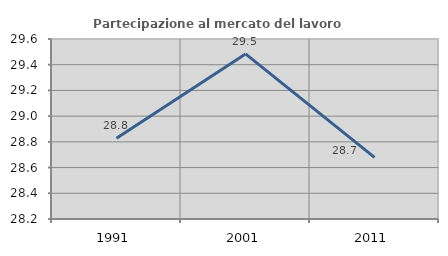
| Category | Partecipazione al mercato del lavoro  femminile |
|---|---|
| 1991.0 | 28.829 |
| 2001.0 | 29.484 |
| 2011.0 | 28.68 |